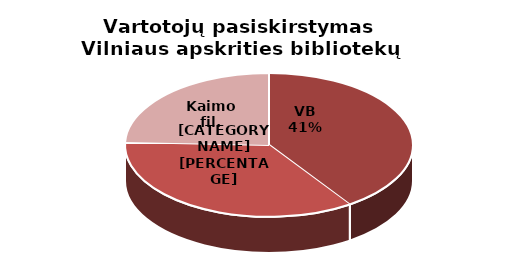
| Category | Series 0 |
|---|---|
| VB | 28134 |
| Miesto fil. | 24386 |
| Kaimo fil. | 16908 |